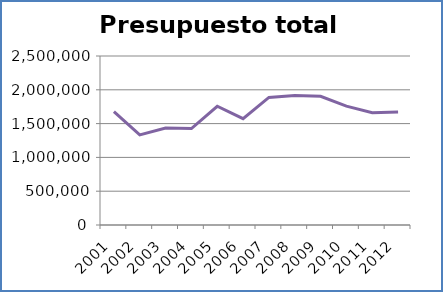
| Category | Presupuesto total |
|---|---|
| 2001 | 1677787 |
| 2002 | 1332074 |
| 2003 | 1434238 |
| 2004 | 1427300 |
| 2005 | 1756683 |
| 2006 | 1572948 |
| 2007 | 1886727.83 |
| 2008 | 1914811 |
| 2009 | 1903030 |
| 2010 | 1758033.4 |
| 2011 | 1662074 |
| 2012 | 1671583 |